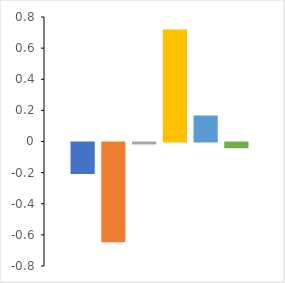
| Category | formic | acetic | propionic | butyric | pentanoic | hexanoic |
|---|---|---|---|---|---|---|
| PC1 | -0.202 | -0.641 | -0.012 | 0.72 | 0.167 | -0.037 |